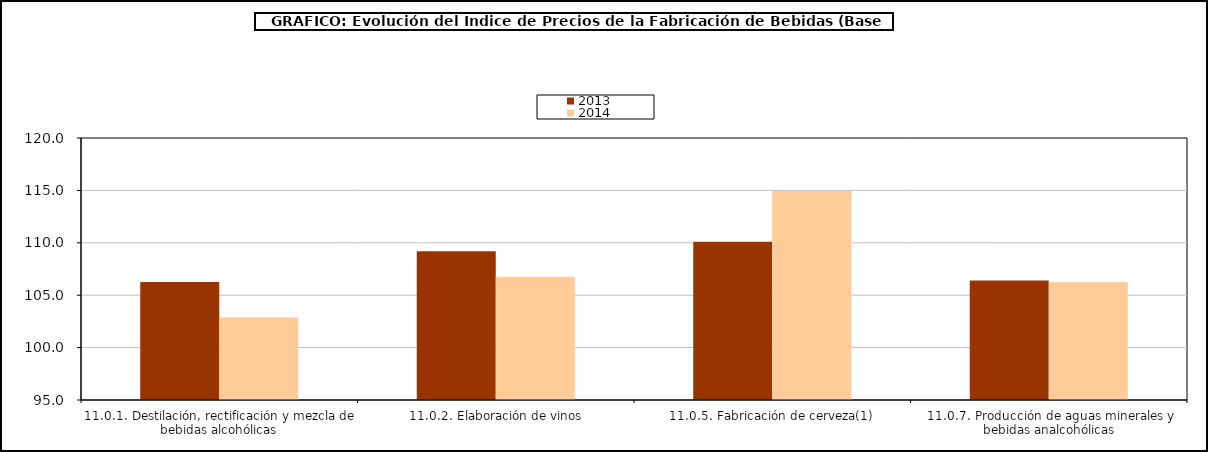
| Category | 2013 | 2014 |
|---|---|---|
| 11.0.1. Destilación, rectificación y mezcla de bebidas alcohólicas | 106.266 | 102.864 |
| 11.0.2. Elaboración de vinos | 109.204 | 106.768 |
| 11.0.5. Fabricación de cerveza(1) | 110.094 | 114.943 |
| 11.0.7. Producción de aguas minerales y bebidas analcohólicas | 106.392 | 106.238 |